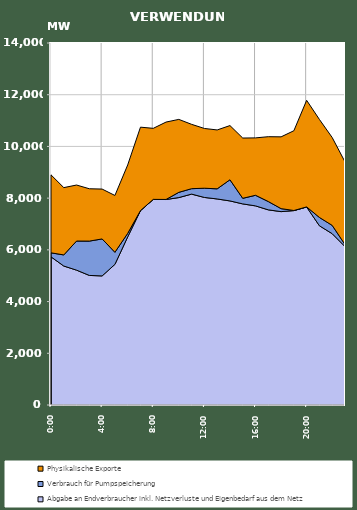
| Category | Abgabe an Endverbraucher inkl. Netzverluste und Eigenbedarf aus dem Netz | Verbrauch für Pumpspeicherung | Physikalische Exporte |
|---|---|---|---|
| 2007-01-17 | 5729.989 | 155.467 | 3014.53 |
| 2007-01-17 01:00:00 | 5374.528 | 429.061 | 2603.357 |
| 2007-01-17 02:00:00 | 5215.339 | 1125.7 | 2166.089 |
| 2007-01-17 03:00:00 | 5011.144 | 1327.611 | 2024.085 |
| 2007-01-17 04:00:00 | 4991.766 | 1430.698 | 1928.513 |
| 2007-01-17 05:00:00 | 5438.045 | 467.936 | 2197.642 |
| 2007-01-17 06:00:00 | 6500.568 | 137.223 | 2646.005 |
| 2007-01-17 07:00:00 | 7517.913 | 0.524 | 3226.847 |
| 2007-01-17 08:00:00 | 7951.445 | 0.553 | 2747.533 |
| 2007-01-17 09:00:00 | 7946.709 | 2.924 | 2992.496 |
| 2007-01-17 10:00:00 | 8021.239 | 203.276 | 2821.631 |
| 2007-01-17 11:00:00 | 8155.613 | 210.212 | 2488.424 |
| 2007-01-17 12:00:00 | 8027.226 | 356.96 | 2310.571 |
| 2007-01-17 13:00:00 | 7968.451 | 391.344 | 2277.698 |
| 2007-01-17 14:00:00 | 7892.46 | 818.185 | 2096.302 |
| 2007-01-17 15:00:00 | 7777.197 | 215.789 | 2331.447 |
| 2007-01-17 16:00:00 | 7700.587 | 409.505 | 2220.617 |
| 2007-01-17 17:00:00 | 7546.953 | 321.425 | 2507.801 |
| 2007-01-17 18:00:00 | 7478.57 | 115.494 | 2776.165 |
| 2007-01-17 19:00:00 | 7517.946 | 3.604 | 3085.801 |
| 2007-01-17 20:00:00 | 7657.816 | 3.63 | 4121.708 |
| 2007-01-17 21:00:00 | 6931.389 | 321.682 | 3789.885 |
| 2007-01-17 22:00:00 | 6624.959 | 321.391 | 3397.079 |
| 2007-01-17 23:00:00 | 6127.924 | 77.719 | 3198.149 |